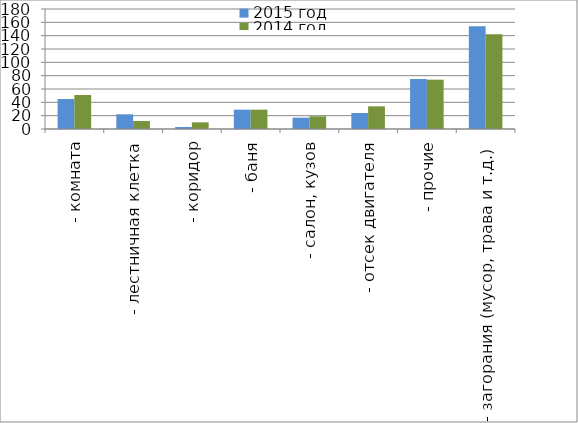
| Category | 2015 год | 2014 год |
|---|---|---|
|  - комната | 45 | 51 |
|  - лестничная клетка | 22 | 12 |
|  - коридор | 3 | 10 |
|  - баня | 29 | 29 |
|  - салон, кузов | 17 | 19 |
|  - отсек двигателя | 24 | 34 |
| - прочие | 75 | 74 |
| - загорания (мусор, трава и т.д.)  | 154 | 142 |